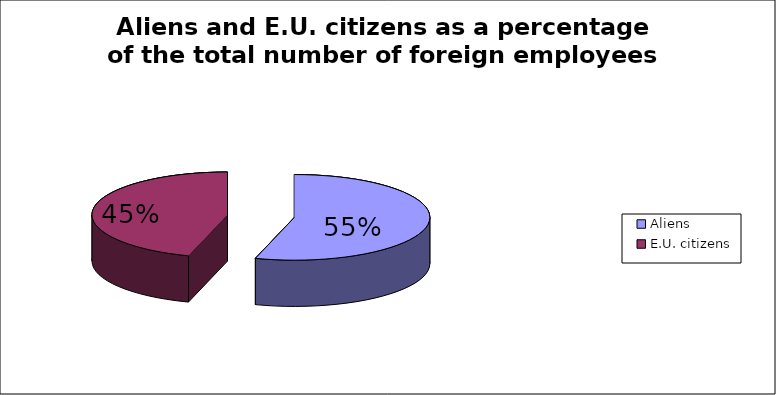
| Category | Series 0 |
|---|---|
| Aliens | 106834.25 |
| E.U. citizens | 88662.25 |